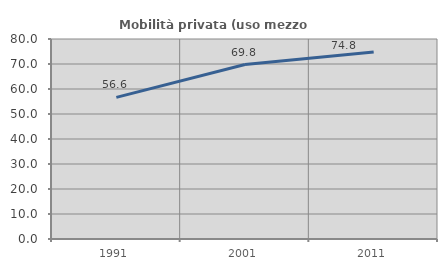
| Category | Mobilità privata (uso mezzo privato) |
|---|---|
| 1991.0 | 56.639 |
| 2001.0 | 69.781 |
| 2011.0 | 74.763 |